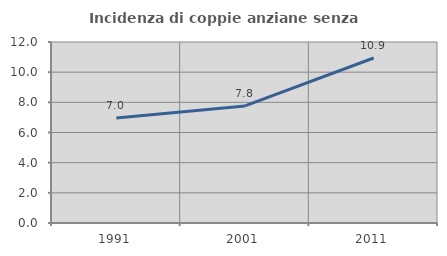
| Category | Incidenza di coppie anziane senza figli  |
|---|---|
| 1991.0 | 6.964 |
| 2001.0 | 7.763 |
| 2011.0 | 10.938 |